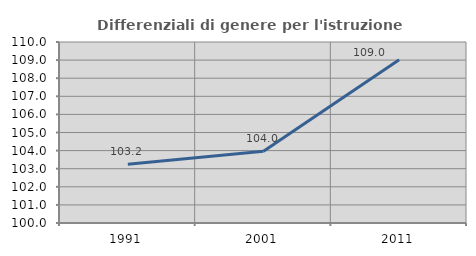
| Category | Differenziali di genere per l'istruzione superiore |
|---|---|
| 1991.0 | 103.246 |
| 2001.0 | 103.96 |
| 2011.0 | 109.021 |